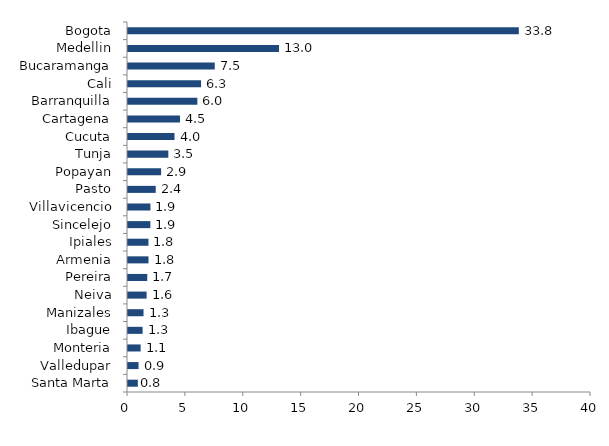
| Category | Series 0 |
|---|---|
| Santa Marta | 0.848 |
| Valledupar | 0.911 |
| Monteria | 1.091 |
| Ibague | 1.262 |
| Manizales | 1.342 |
| Neiva | 1.608 |
| Pereira | 1.663 |
| Armenia | 1.771 |
| Ipiales | 1.768 |
| Sincelejo | 1.933 |
| Villavicencio | 1.941 |
| Pasto | 2.396 |
| Popayan | 2.861 |
| Tunja | 3.484 |
| Cucuta | 4.02 |
| Cartagena | 4.491 |
| Barranquilla | 5.993 |
| Cali | 6.311 |
| Bucaramanga | 7.497 |
| Medellin | 13.045 |
| Bogota | 33.764 |